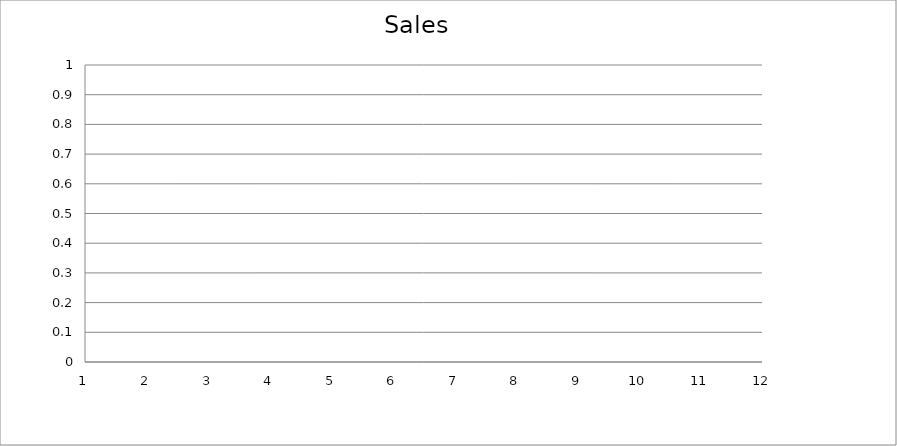
| Category | Actual |
|---|---|
| 0 | 1740 |
| 1 | 840 |
| 2 | 1190 |
| 3 | 3180 |
| 4 | 1790 |
| 5 | 2140 |
| 6 | 3040 |
| 7 | 1170 |
| 8 | 3010 |
| 9 | 1300 |
| 10 | 1030 |
| 11 | 940 |